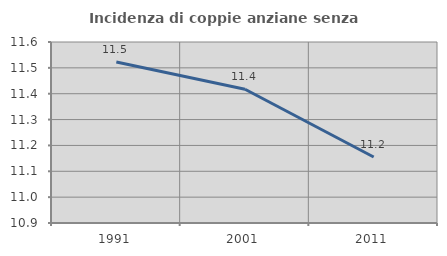
| Category | Incidenza di coppie anziane senza figli  |
|---|---|
| 1991.0 | 11.523 |
| 2001.0 | 11.417 |
| 2011.0 | 11.155 |